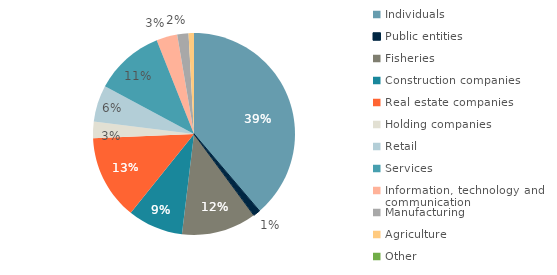
| Category | Series 0 |
|---|---|
| Individuals | 363150 |
| Public entities | 10556 |
| Fisheries | 112497 |
| Construction companies  | 83011 |
| Real estate companies | 126962 |
| Holding companies | 24715 |
| Retail | 54812 |
| Services | 104585 |
| Information, technology and communication | 31323 |
| Manufacturing | 16919 |
| Agriculture | 8103 |
| Other | 3 |